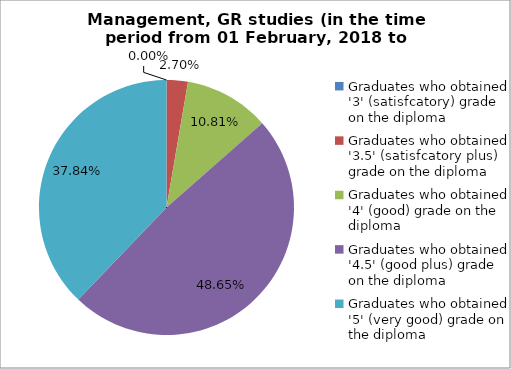
| Category | Series 0 |
|---|---|
| Graduates who obtained '3' (satisfcatory) grade on the diploma | 0 |
| Graduates who obtained '3.5' (satisfcatory plus) grade on the diploma | 2.703 |
| Graduates who obtained '4' (good) grade on the diploma | 10.811 |
| Graduates who obtained '4.5' (good plus) grade on the diploma | 48.649 |
| Graduates who obtained '5' (very good) grade on the diploma | 37.838 |